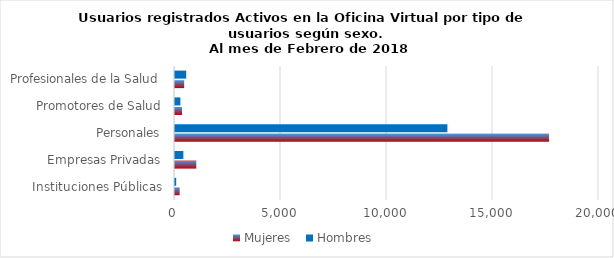
| Category | Mujeres | Hombres |
|---|---|---|
| Instituciones Públicas | 219 | 56 |
| Empresas Privadas | 1005 | 395 |
| Personales | 17643 | 12849 |
| Promotores de Salud | 329 | 254 |
| Profesionales de la Salud | 432 | 528 |